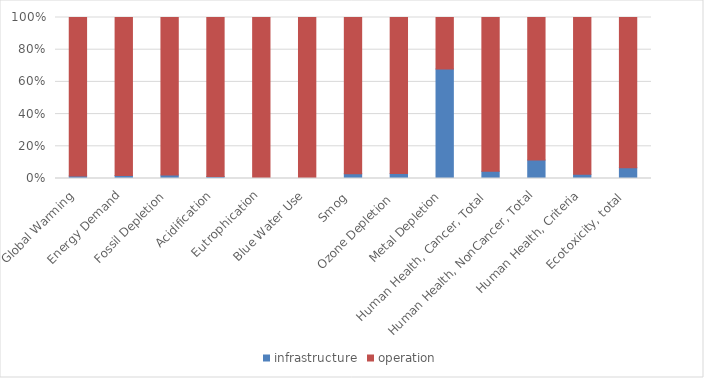
| Category | infrastructure | operation |
|---|---|---|
| Global Warming | 0.032 | 1.966 |
| Energy Demand | 0.51 | 27.085 |
| Fossil Depletion | 0.011 | 0.495 |
| Acidification | 0.008 | 0.624 |
| Eutrophication | 0 | 0.011 |
| Blue Water Use | 0 | 1.207 |
| Smog  | 0.003 | 0.09 |
| Ozone Depletion  | 0 | 0 |
| Metal Depletion | 0.031 | 0.015 |
| Human Health, Cancer, Total  | 0 | 0 |
| Human Health, NonCancer, Total | 0 | 0 |
| Human Health, Criteria | 0 | 0.002 |
| Ecotoxicity, total  | 0 | 0.001 |